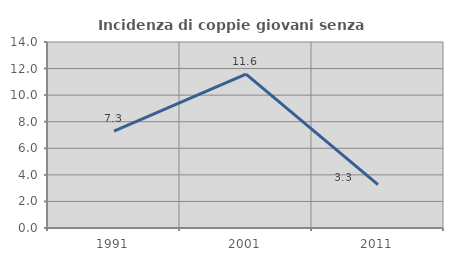
| Category | Incidenza di coppie giovani senza figli |
|---|---|
| 1991.0 | 7.292 |
| 2001.0 | 11.576 |
| 2011.0 | 3.261 |